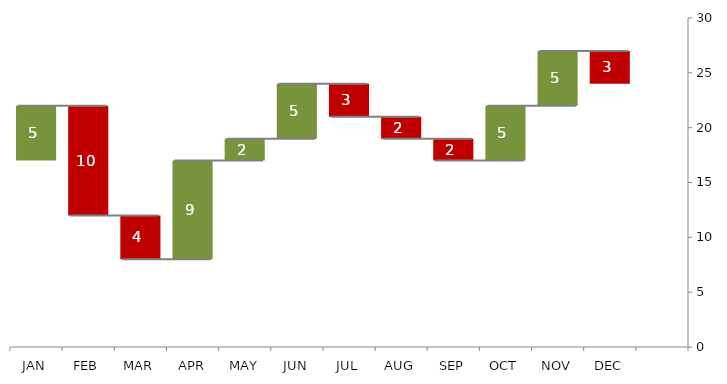
| Category | Series 0 | Series 1 | Series 2 |
|---|---|---|---|
| JAN | 17 | 5 | 0 |
| FEB | 12 | 0 | 10 |
| MAR | 8 | 0 | 4 |
| APR | 8 | 9 | 0 |
| MAY | 17 | 2 | 0 |
| JUN | 19 | 5 | 0 |
| JUL | 21 | 0 | 3 |
| AUG | 19 | 0 | 2 |
| SEP | 17 | 0 | 2 |
| OCT | 17 | 5 | 0 |
| NOV | 22 | 5 | 0 |
| DEC | 24 | 0 | 3 |